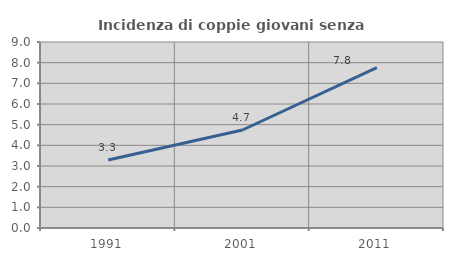
| Category | Incidenza di coppie giovani senza figli |
|---|---|
| 1991.0 | 3.292 |
| 2001.0 | 4.741 |
| 2011.0 | 7.759 |